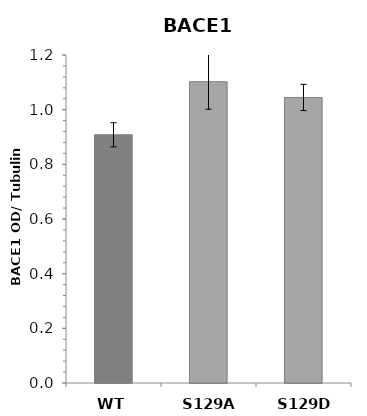
| Category | Series 0 |
|---|---|
| WT | 0.908 |
| S129A | 1.102 |
| S129D | 1.045 |